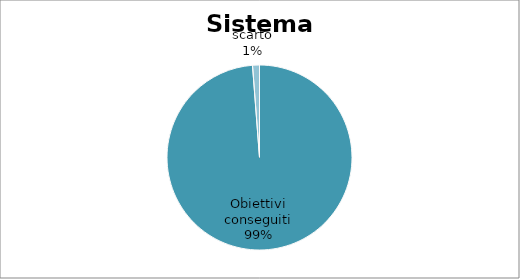
| Category | Series 0 |
|---|---|
| Obiettivi conseguiti | 98.793 |
| scarto | 1.207 |